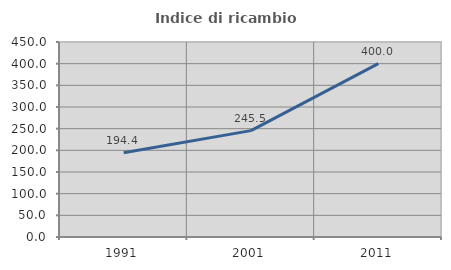
| Category | Indice di ricambio occupazionale  |
|---|---|
| 1991.0 | 194.444 |
| 2001.0 | 245.455 |
| 2011.0 | 400 |